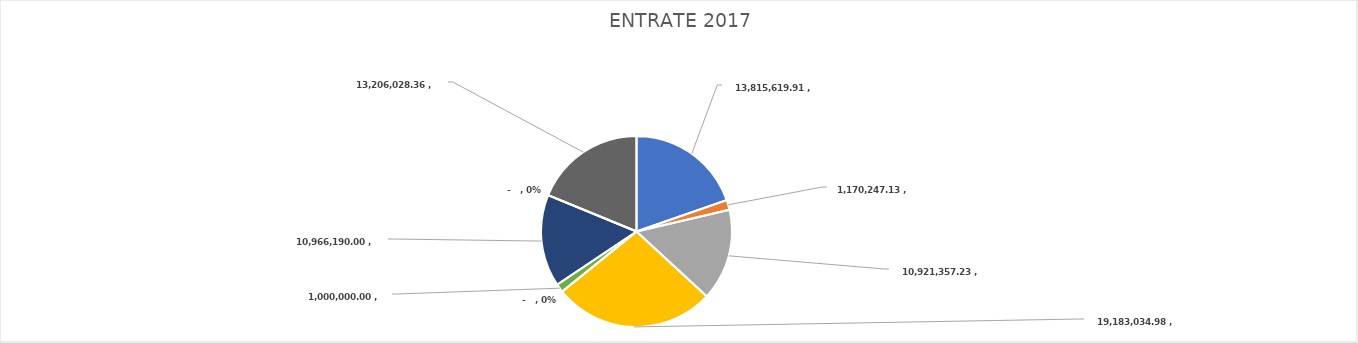
| Category | Series 0 |
|---|---|
| 0 | 13815619.91 |
| 1 | 1170247.13 |
| 2 | 10921357.23 |
| 3 | 19183034.98 |
| 4 | 0 |
| 5 | 1000000 |
| 6 | 10966190 |
| 7 | 0 |
| 8 | 13206028.36 |